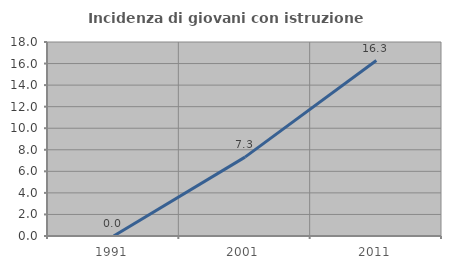
| Category | Incidenza di giovani con istruzione universitaria |
|---|---|
| 1991.0 | 0 |
| 2001.0 | 7.317 |
| 2011.0 | 16.279 |